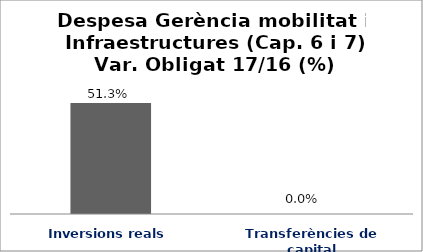
| Category | Series 0 |
|---|---|
| Inversions reals | 0.513 |
| Transferències de capital | 0 |